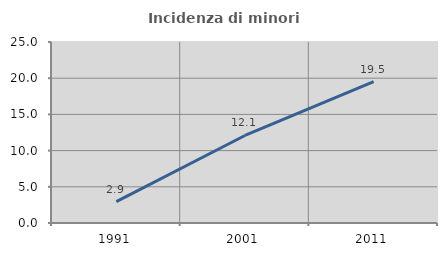
| Category | Incidenza di minori stranieri |
|---|---|
| 1991.0 | 2.941 |
| 2001.0 | 12.088 |
| 2011.0 | 19.531 |